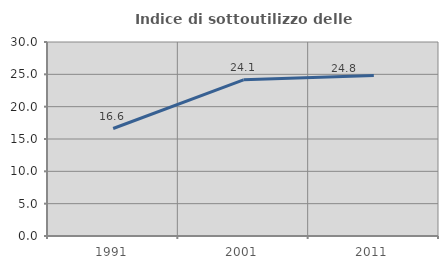
| Category | Indice di sottoutilizzo delle abitazioni  |
|---|---|
| 1991.0 | 16.62 |
| 2001.0 | 24.143 |
| 2011.0 | 24.806 |